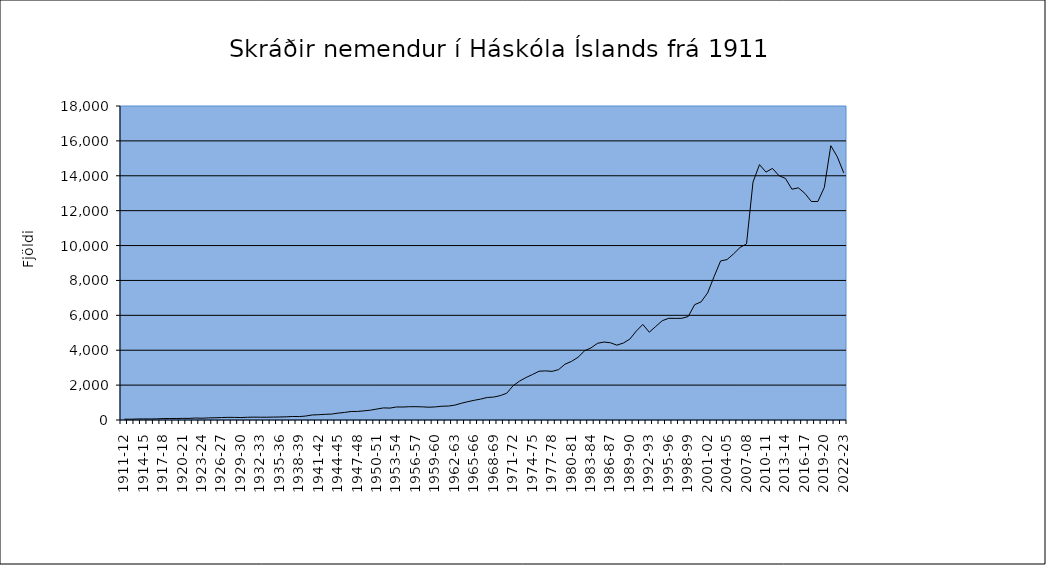
| Category | Series 0 |
|---|---|
| 1911-12 | 45 |
| 1912-13 | 45 |
| 1913-14 | 58 |
| 1914-15 | 62 |
| 1915-16 | 59 |
| 1916-17 | 66 |
| 1917-18 | 80 |
| 1918-19 | 87 |
| 1919-20 | 84 |
| 1920-21 | 94 |
| 1921-22 | 92 |
| 1922-23 | 113 |
| 1923-24 | 103 |
| 1924-25 | 120 |
| 1925-26 | 128 |
| 1926-27 | 140 |
| 1927-28 | 152 |
| 1928-29 | 149 |
| 1929-30 | 141 |
| 1930-31 | 156 |
| 1931-32 | 165 |
| 1932-33 | 160 |
| 1933-34 | 160 |
| 1934-35 | 167 |
| 1935-36 | 172 |
| 1936-37 | 182 |
| 1937-38 | 202 |
| 1938-39 | 197 |
| 1939-40 | 227 |
| 1940-41 | 289 |
| 1941-42 | 303 |
| 1942-43 | 326 |
| 1943-44 | 339 |
| 1944-45 | 395 |
| 1945-46 | 433 |
| 1946-47 | 488 |
| 1947-48 | 491 |
| 1948-49 | 525 |
| 1949-50 | 565 |
| 1950-51 | 631 |
| 1951-52 | 693 |
| 1952-53 | 683 |
| 1953-54 | 747 |
| 1954-55 | 744 |
| 1955-56 | 762 |
| 1956-57 | 763 |
| 1957-58 | 753 |
| 1958-59 | 733 |
| 1959-60 | 751 |
| 1960-61 | 790 |
| 1961-62 | 799 |
| 1962-63 | 852 |
| 1963-64 | 960 |
| 1964-65 | 1049 |
| 1965-66 | 1130 |
| 1966-67 | 1200 |
| 1967-68 | 1292 |
| 1968-69 | 1314 |
| 1969-70 | 1397 |
| 1970-71 | 1533 |
| 1971-72 | 1967 |
| 1972-73 | 2233 |
| 1973-74 | 2438 |
| 1974-75 | 2611 |
| 1975-76 | 2796 |
| 1976-77 | 2816 |
| 1977-78 | 2787 |
| 1978-79 | 2886 |
| 1979-80 | 3200 |
| 1980-81 | 3360 |
| 1981-82 | 3594 |
| 1982-83 | 3961 |
| 1983-84 | 4133 |
| 1984-85 | 4394 |
| 1985-86 | 4470 |
| 1986-87 | 4428 |
| 1987-88 | 4290 |
| 1988-89 | 4413 |
| 1989-90 | 4638 |
| 1990-91 | 5101 |
| 1991-92 | 5478 |
| 1992-93 | 5033 |
| 1993-94 | 5364 |
| 1994-95 | 5692 |
| 1995-96 | 5831 |
| 1996-97 | 5824 |
| 1997-98 | 5829 |
| 1998-99 | 5930 |
| 1999-00 | 6612 |
| 2000-01 | 6773 |
| 2001-02 | 7288 |
| 2002-03 | 8224 |
| 2003-04 | 9117 |
| 2004-05 | 9197 |
| 2005-06 | 9523 |
| 2006-07 | 9889 |
| 2007-08 | 10097 |
| 2008-09* | 13640 |
| 2009-10 | 14639 |
| 2010-11 | 14212 |
| 2011-12 | 14422 |
| 2012-13 | 14009 |
| 2013-14 | 13848 |
| 2014-15 | 13231 |
| 2015-16 | 13307 |
| 2016-17 | 12992 |
| 2017-18 | 12526 |
| 2018-19 | 12524 |
| 2019-20 | 13333 |
| 2020-21 | 15725 |
| 2021-22 | 15089 |
| 2022-23 | 14167 |